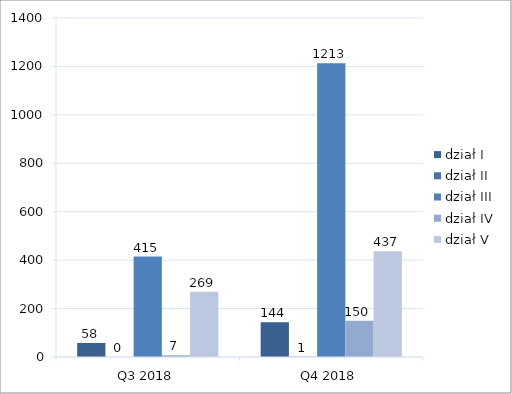
| Category | dział I | dział II | dział III | dział IV | dział V |
|---|---|---|---|---|---|
| Q3 2018 | 58 | 0 | 415 | 7 | 269 |
| Q4 2018 | 144 | 1 | 1213 | 150 | 437 |